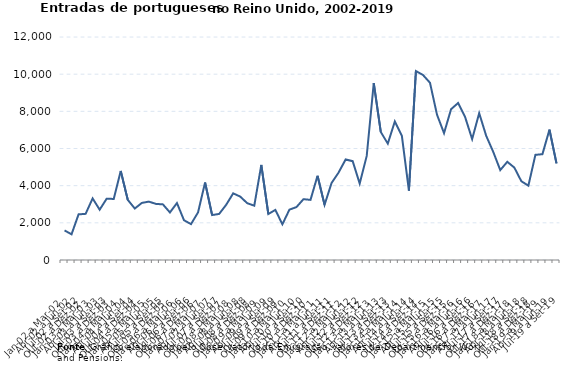
| Category | Series 0 |
|---|---|
| Jan-02 a Mar-02 | 1592 |
| Abr-02 a Jun-02 | 1383 |
| Jul-02 a Set-02 | 2457 |
| Out-02 a Dez-02 | 2483 |
| Jan-03 a Mar-03 | 3314 |
| Abr-03 a Jun-03 | 2707 |
| Jul-03 a Set-03 | 3300 |
| Out-03 a Dez-03 | 3285 |
| Jan-04 a Mar-04 | 4792 |
| Abr-04 a Jun-04 | 3237 |
| Jul-04 a Set-04 | 2770 |
| Out-04 a Dez-04 | 3071 |
| Jan-05 a Mar-05 | 3142 |
| Abr-05 a Jun-05 | 3020 |
| Jul-05 a Set-05 | 2993 |
| Out-05 a Dez-05 | 2558 |
| Jan-06 a Mar-06 | 3064 |
| Abr-06 a Jun-06 | 2139 |
| Jul-06 a Set-06 | 1931 |
| Out-06 a Dez-06 | 2563 |
| Jan-07 a Mar-07 | 4170 |
| Abr-07 a Jun-07 | 2418 |
| Jul-07 a Set-07 | 2479 |
| Out-07 a Dez-07 | 2969 |
| Jan-08 a Mar-08 | 3587 |
| Abr-08 a Jun-08 | 3411 |
| Jul-08 a Set-08 | 3057 |
| Out-08 a Dez-08 | 2922 |
| Jan-09 a Mar-09 | 5115 |
| Abr-09 a Jun-09 | 2475 |
| Jul-09 a Set-09 | 2695 |
| Out-09 a Dez-09 | 1921 |
| Jan-10 a Mar-10 | 2709 |
| Abr-10 a Jun-10 | 2847 |
| Jul-10 a Set-10 | 3273 |
| Out-10 a Dez-10 | 3235 |
| Jan-11 a Mar-11 | 4532 |
| Abr-11 a Jun-11 | 2971 |
| Jul-11 a Set-11 | 4141 |
| Out-11 a Dez-11 | 4707 |
| Jan-12 a Mar-12 | 5413 |
| Abr-12 a Jun-12 | 5319 |
| Jul-12 a Set-12 | 4117 |
| Out-12 a Dez-12 | 5601 |
| Jan-13 a Mar-13 | 9518 |
| Abr-13 a Jun-13 | 6889 |
| Jul-13 a Set-13 | 6261 |
| Out-13 a Dez-13 | 7456 |
| Jan-14 a Mar-14 | 6682 |
| Abr-14 a Jun-14 | 3734 |
| Jul-14 a Set-14 | 10167 |
| Out-14 a Dez-14 | 9958 |
| Jan-15 a Mar-15 | 9538 |
| Abr-15 a Jun-15 | 7818 |
| Jul-15 a Set-15 | 6826 |
| Out-15 a Dez-15 | 8114 |
| Jan-16 a Mar-16 | 8448 |
| Abr-16 a Jun-16 | 7690 |
| Jul-16 a Set-16 | 6506 |
| Out-16 a Dez-16 | 7901 |
| Jan-17 a Mar-17 | 6681 |
| Abr-17 a Jun-17 | 5819 |
| Jul-17 a Set-17 | 4838 |
| Out-17 a Dez-17 | 5283 |
| Jan-18 a Mar-18 | 4974 |
| Abr-18 a Jun-18 | 4239 |
| Jul-18 a Set-18 | 3999 |
| Out-18 a Dez-18 | 5658 |
| Jan-19 a Mar-19 | 5694 |
| Abr-19 a Jun-19 | 7015 |
| Jul-19 a Set-19 | 5201 |